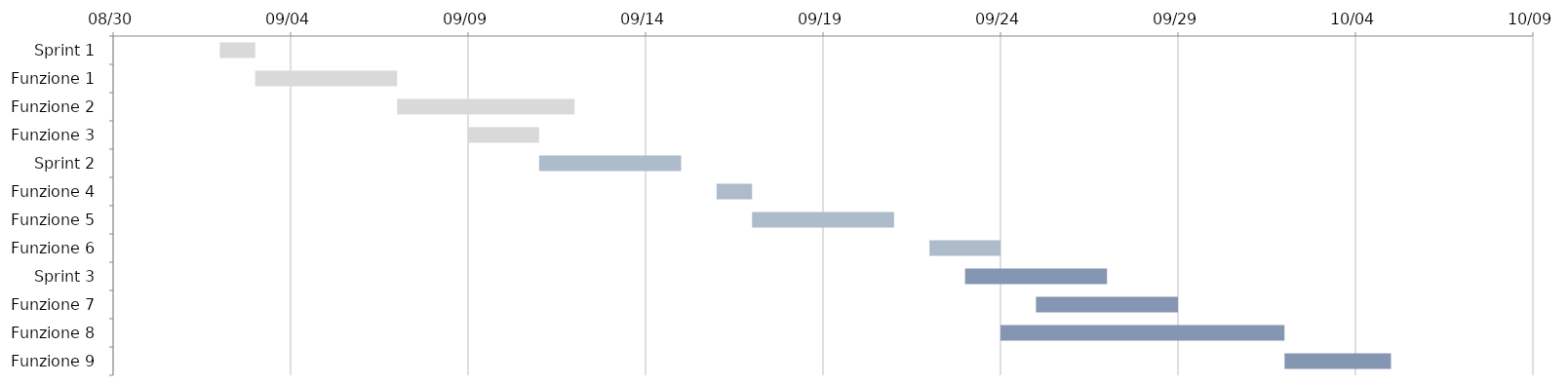
| Category | INIZIO | GIORNI |
|---|---|---|
| Sprint 1 | 2022-09-02 | 1 |
| Funzione 1 | 2022-09-03 | 4 |
| Funzione 2 | 2022-09-07 | 5 |
| Funzione 3 | 2022-09-09 | 2 |
| Sprint 2 | 2022-09-11 | 4 |
| Funzione 4 | 2022-09-16 | 1 |
| Funzione 5 | 2022-09-17 | 4 |
| Funzione 6 | 2022-09-22 | 2 |
| Sprint 3 | 2022-09-23 | 4 |
| Funzione 7 | 2022-09-25 | 4 |
| Funzione 8 | 2022-09-24 | 8 |
| Funzione 9 | 2022-10-02 | 3 |